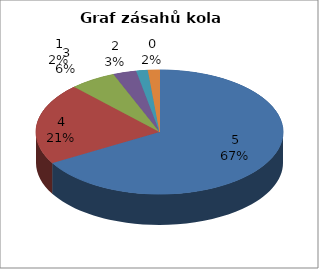
| Category | Series 0 |
|---|---|
| 5.0 | 44 |
| 4.0 | 14 |
| 3.0 | 4 |
| 2.0 | 2 |
| 1.0 | 1 |
| 0.0 | 1 |